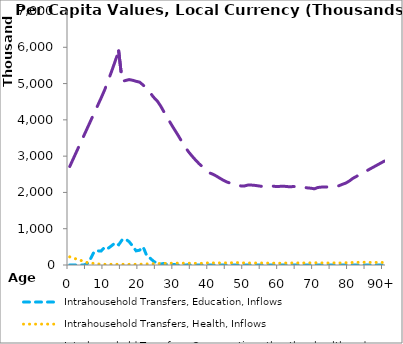
| Category | Intrahousehold Transfers, Education, Inflows | Intrahousehold Transfers, Health, Inflows | Intrahousehold Transfers, Consumption other than health and education, Inflows | Intrahousehold Transfers, Saving, Inflows |
|---|---|---|---|---|
| 0 | 0 | 224271.037 | 2715015.584 |  |
|  | 0 | 193319.911 | 2925314.28 |  |
| 2 | 0 | 162368.786 | 3135612.976 |  |
| 3 | 0 | 131417.66 | 3345911.672 |  |
| 4 | 0 | 100466.534 | 3556210.368 |  |
| 5 | 37388.76 | 67749.179 | 3766509.064 |  |
| 6 | 182815.2 | 53452.977 | 3976807.76 |  |
| 7 | 370899.12 | 41658.584 | 4187106.456 |  |
| 8 | 389180.28 | 30087.363 | 4397405.152 |  |
| 9 | 387370.32 | 18487.006 | 4607703.848 |  |
| 10 | 489823.68 | 17802.319 | 4827690.525 |  |
| 11 | 460777.08 | 18654.847 | 5085023.362 |  |
| 12 | 532255.68 | 18940.736 | 5342788.104 |  |
| 13 | 610427.28 | 19661.403 | 5617054.215 |  |
| 14 | 557597.52 | 19924.394 | 5901389.707 |  |
| 15 | 694011.84 | 18428.764 | 5060701.699 |  |
| 16 | 713380.44 | 18321.401 | 5085221.684 |  |
| 17 | 640842 | 18105.113 | 5109875.486 |  |
| 18 | 520515.48 | 17939.475 | 5091105.592 |  |
| 19 | 389012.76 | 17833.316 | 5062272.754 |  |
| 20 | 408773.4 | 22123.426 | 5039486.969 |  |
| 21 | 498201.96 | 24496.248 | 4959442.586 |  |
| 22 | 266415.96 | 28100.577 | 4860307.756 |  |
| 23 | 187286.64 | 31128.289 | 4746674.487 |  |
| 24 | 102513.372 | 35535.143 | 4623497.302 |  |
| 25 | 47770.128 | 37982.75 | 4525362.848 |  |
| 26 | 26402.64 | 40620.556 | 4384092.021 |  |
| 27 | 43719.756 | 42631.193 | 4211587.845 |  |
| 28 | 7772.55 | 46386.505 | 4048627.438 |  |
| 29 | 14551.26 | 49296.04 | 3884140.676 |  |
| 30 | 12040.896 | 52904.367 | 3728152.755 |  |
| 31 | 559.968 | 50802.438 | 3575187.322 |  |
| 32 | 2520.694 | 50116.214 | 3412068.124 |  |
| 33 | 0 | 49831.102 | 3253730.986 |  |
| 34 | 6956.779 | 49536.96 | 3118517.953 |  |
| 35 | 0 | 46726.478 | 3001584.984 |  |
| 36 | 0 | 46121.867 | 2892958.667 |  |
| 37 | 0 | 45847.339 | 2791759.737 |  |
| 38 | 0 | 47041.545 | 2706788.834 |  |
| 39 | 0 | 57786.634 | 2607868.45 |  |
| 40 | 0 | 56331.842 | 2538856.42 |  |
| 41 | 0 | 56465.04 | 2499598.872 |  |
| 42 | 0 | 57430.008 | 2448218.084 |  |
| 43 | 0 | 56637.89 | 2388973.378 |  |
| 44 | 0 | 58012.752 | 2333141.697 |  |
| 45 | 0 | 58132.649 | 2286233.879 |  |
| 46 | 0 | 61276.247 | 2254720.45 |  |
| 47 | 0 | 62030.174 | 2228902.922 |  |
| 48 | 0 | 64762.003 | 2201027.89 |  |
| 49 | 0 | 64261.271 | 2178624.611 |  |
| 50 | 0 | 54343.977 | 2178663.181 |  |
| 51 | 0 | 54771.871 | 2203405.709 |  |
| 52 | 0 | 54086.002 | 2202463.107 |  |
| 53 | 0 | 54132.333 | 2193779.545 |  |
| 54 | 0 | 54361.388 | 2180555.936 |  |
| 55 | 0 | 54870.884 | 2165913.733 |  |
| 56 | 0 | 53744.555 | 2182424.804 |  |
| 57 | 0 | 53144.585 | 2174329.349 |  |
| 58 | 0 | 52556.87 | 2176706.118 |  |
| 59 | 0 | 50409.876 | 2162169.76 |  |
| 60 | 0 | 49939.864 | 2166321.698 |  |
| 61 | 0 | 50715.696 | 2171852.01 |  |
| 62 | 0 | 54180.976 | 2164413.001 |  |
| 63 | 0 | 54115.308 | 2153880.351 |  |
| 64 | 0 | 56085.55 | 2163223.029 |  |
| 65 | 0 | 56983.786 | 2157052.339 |  |
| 66 | 0 | 56468.081 | 2147424.978 |  |
| 67 | 0 | 56188.306 | 2141787.915 |  |
| 68 | 0 | 58791.706 | 2125679.582 |  |
| 69 | 0 | 60783.859 | 2115846.001 |  |
| 70 | 0 | 61018.598 | 2099590.576 |  |
| 71 | 0 | 61370.172 | 2136282.056 |  |
| 72 | 0 | 58998.218 | 2146491.047 |  |
| 73 | 0 | 55804.268 | 2146819.163 |  |
| 74 | 0 | 54986.106 | 2152450.498 |  |
| 75 | 0 | 57776.001 | 2152648.122 |  |
| 76 | 0 | 58117.758 | 2164144.656 |  |
| 77 | 0 | 56554.5 | 2183156.944 |  |
| 78 | 0 | 56616.634 | 2222558.324 |  |
| 79 | 0 | 62271.447 | 2258106.579 |  |
| 80 | 0 | 63925.758 | 2314195.137 |  |
| 81 | 0 | 69808.831 | 2386533.745 |  |
| 82 | 0 | 72713.671 | 2439357.144 |  |
| 83 | 0 | 74488.215 | 2492180.543 |  |
| 84 | 0 | 76239.705 | 2545003.942 |  |
| 85 | 0 | 72376.383 | 2597827.342 |  |
| 86 | 0 | 71765.352 | 2650650.741 |  |
| 87 | 0 | 71154.321 | 2703474.14 |  |
| 88 | 0 | 70543.29 | 2756297.54 |  |
| 89 | 0 | 69932.258 | 2809120.939 |  |
| 90+ | 0 | 69321.227 | 2861944.338 |  |